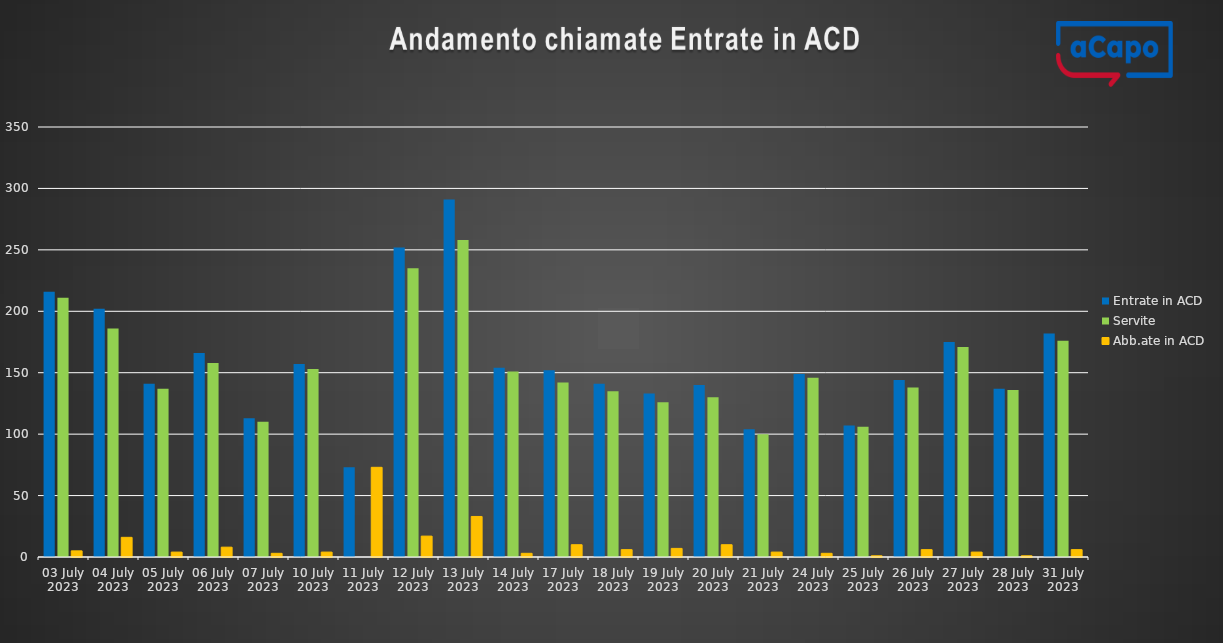
| Category | Entrate in ACD | Servite | Abb.ate in ACD |
|---|---|---|---|
| 2023-07-03 | 216 | 211 | 5 |
| 2023-07-04 | 202 | 186 | 16 |
| 2023-07-05 | 141 | 137 | 4 |
| 2023-07-06 | 166 | 158 | 8 |
| 2023-07-07 | 113 | 110 | 3 |
| 2023-07-10 | 157 | 153 | 4 |
| 2023-07-11 | 73 | 0 | 73 |
| 2023-07-12 | 252 | 235 | 17 |
| 2023-07-13 | 291 | 258 | 33 |
| 2023-07-14 | 154 | 151 | 3 |
| 2023-07-17 | 152 | 142 | 10 |
| 2023-07-18 | 141 | 135 | 6 |
| 2023-07-19 | 133 | 126 | 7 |
| 2023-07-20 | 140 | 130 | 10 |
| 2023-07-21 | 104 | 100 | 4 |
| 2023-07-24 | 149 | 146 | 3 |
| 2023-07-25 | 107 | 106 | 1 |
| 2023-07-26 | 144 | 138 | 6 |
| 2023-07-27 | 175 | 171 | 4 |
| 2023-07-28 | 137 | 136 | 1 |
| 2023-07-31 | 182 | 176 | 6 |